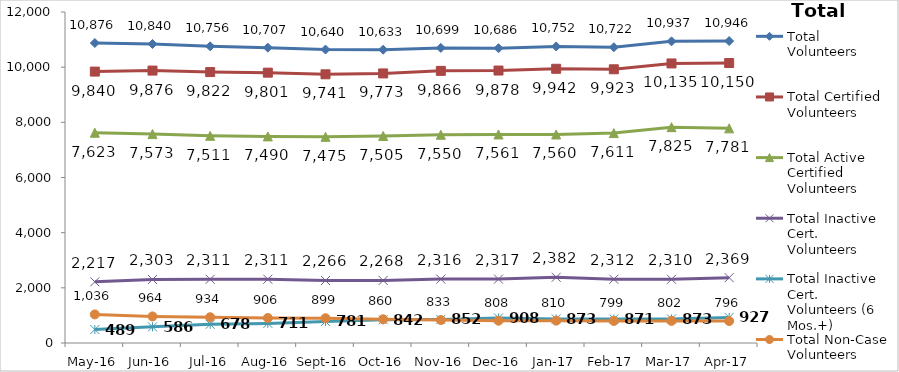
| Category | Total Volunteers | Total Certified Volunteers | Total Active Certified Volunteers | Total Inactive Cert. Volunteers | Total Inactive Cert. Volunteers (6 Mos.+) | Total Non-Case Volunteers |
|---|---|---|---|---|---|---|
| May-16 | 10876 | 9840 | 7623 | 2217 | 489 | 1036 |
| Jun-16 | 10840 | 9876 | 7573 | 2303 | 586 | 964 |
| Jul-16 | 10756 | 9822 | 7511 | 2311 | 678 | 934 |
| Aug-16 | 10707 | 9801 | 7490 | 2311 | 711 | 906 |
| Sep-16 | 10640 | 9741 | 7475 | 2266 | 781 | 899 |
| Oct-16 | 10633 | 9773 | 7505 | 2268 | 842 | 860 |
| Nov-16 | 10699 | 9866 | 7550 | 2316 | 852 | 833 |
| Dec-16 | 10686 | 9878 | 7561 | 2317 | 908 | 808 |
| Jan-17 | 10752 | 9942 | 7560 | 2382 | 873 | 810 |
| Feb-17 | 10722 | 9923 | 7611 | 2312 | 871 | 799 |
| Mar-17 | 10937 | 10135 | 7825 | 2310 | 873 | 802 |
| Apr-17 | 10946 | 10150 | 7781 | 2369 | 927 | 796 |